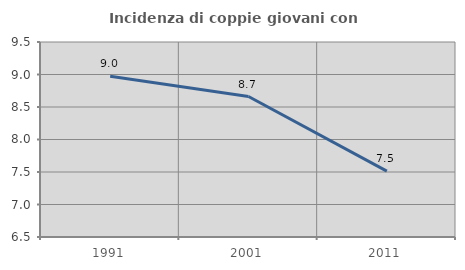
| Category | Incidenza di coppie giovani con figli |
|---|---|
| 1991.0 | 8.974 |
| 2001.0 | 8.661 |
| 2011.0 | 7.513 |